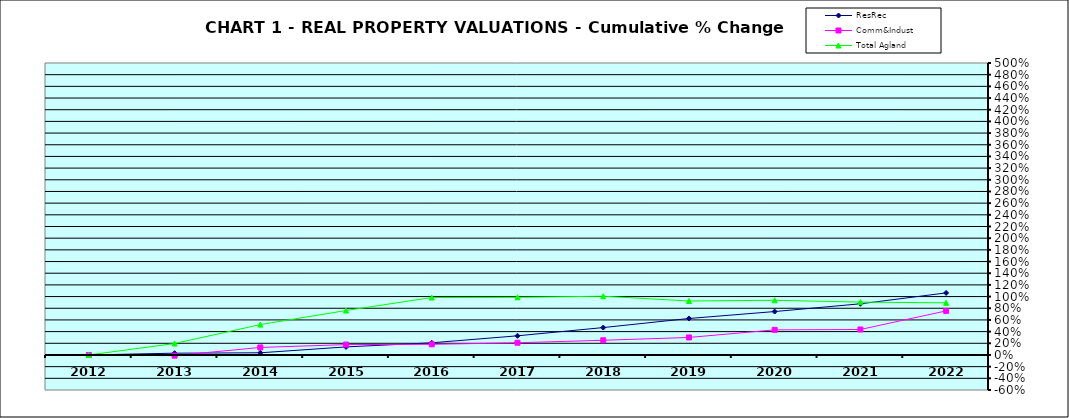
| Category | ResRec | Comm&Indust | Total Agland |
|---|---|---|---|
| 2012.0 | 0 | 0 | 0 |
| 2013.0 | 0.031 | -0.012 | 0.196 |
| 2014.0 | 0.037 | 0.129 | 0.52 |
| 2015.0 | 0.138 | 0.178 | 0.761 |
| 2016.0 | 0.208 | 0.182 | 0.983 |
| 2017.0 | 0.328 | 0.209 | 0.988 |
| 2018.0 | 0.469 | 0.252 | 1.006 |
| 2019.0 | 0.625 | 0.3 | 0.924 |
| 2020.0 | 0.744 | 0.43 | 0.936 |
| 2021.0 | 0.876 | 0.436 | 0.905 |
| 2022.0 | 1.063 | 0.755 | 0.893 |